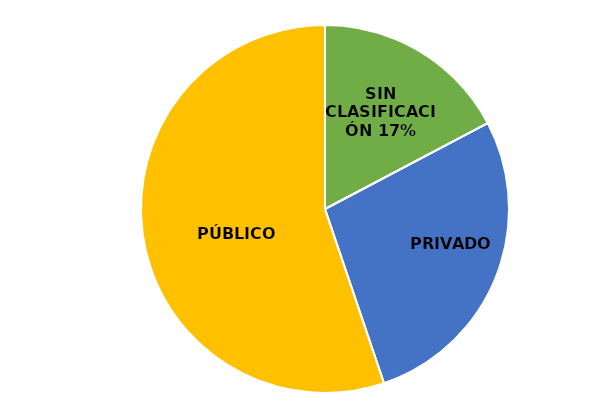
| Category | Ocupados del Sector Salud |
|---|---|
| SIN CLASIFICACIÓN | 0.173 |
| PRIVADO | 0.275 |
| PÚBLICO | 0.552 |